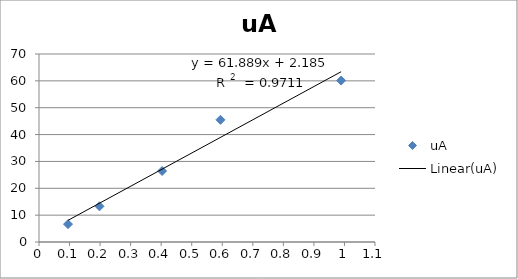
| Category | uA |
|---|---|
| 0.095 | 6.64 |
| 0.198 | 13.29 |
| 0.403 | 26.44 |
| 0.594 | 45.49 |
| 0.989 | 60.11 |